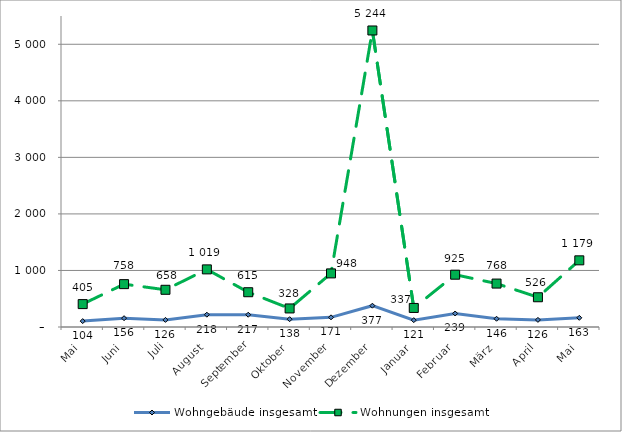
| Category | Wohngebäude insgesamt | Wohnungen insgesamt |
|---|---|---|
| Mai | 104 | 405 |
| Juni | 156 | 758 |
| Juli | 126 | 658 |
| August | 218 | 1019 |
| September | 217 | 615 |
| Oktober | 138 | 328 |
| November | 171 | 948 |
| Dezember | 377 | 5244 |
| Januar | 121 | 337 |
| Februar | 239 | 925 |
| März | 146 | 768 |
| April | 126 | 526 |
| Mai | 163 | 1179 |